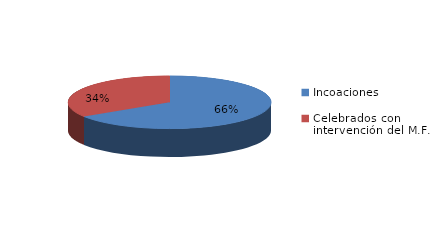
| Category | Series 0 |
|---|---|
| Incoaciones | 3071 |
| Celebrados con intervención del M.F. | 1587 |